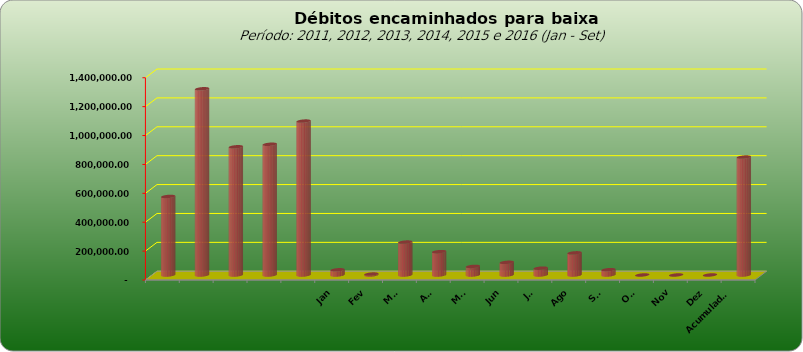
| Category |  543.796,20  |
|---|---|
|  | 543796.2 |
|  | 1289053.69 |
|  | 887573.08 |
|  | 905052.31 |
|  | 1065434.28 |
| Jan | 35964.03 |
| Fev | 6417.54 |
| Mar | 227804.72 |
| Abr | 161576.79 |
| Mai | 59557.82 |
| Jun | 87752.76 |
| Jul | 47447.42 |
| Ago | 153259.03 |
| Set | 36638.73 |
| Out | 0 |
| Nov | 0 |
| Dez | 0 |
| Acumulado
2016 | 816418.84 |